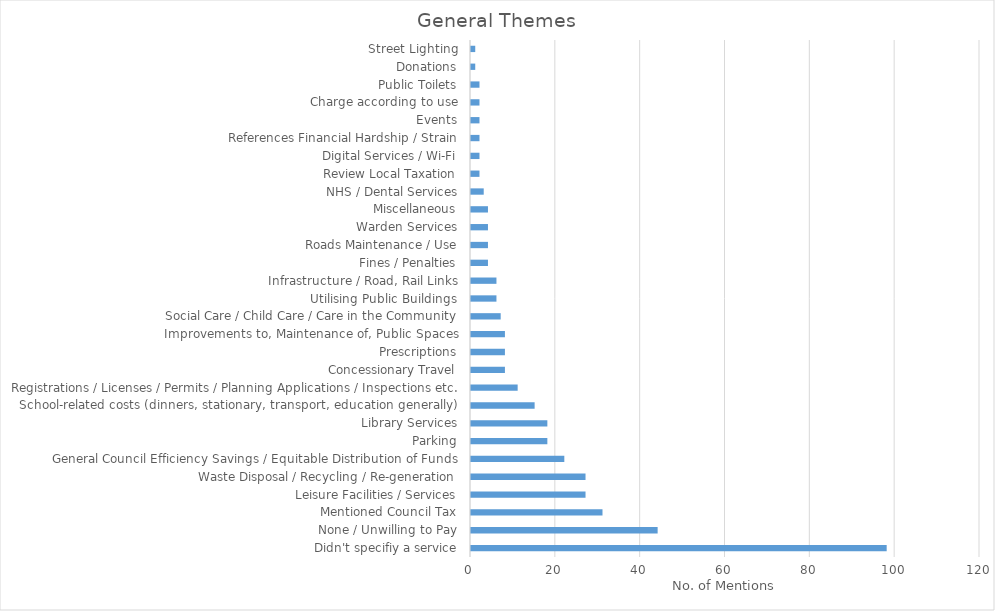
| Category | Series 0 |
|---|---|
| Didn't specifiy a service | 98 |
| None / Unwilling to Pay | 44 |
| Mentioned Council Tax | 31 |
| Leisure Facilities / Services | 27 |
| Waste Disposal / Recycling / Re-generation | 27 |
| General Council Efficiency Savings / Equitable Distribution of Funds | 22 |
| Parking | 18 |
| Library Services | 18 |
| School-related costs (dinners, stationary, transport, education generally) | 15 |
| Registrations / Licenses / Permits / Planning Applications / Inspections etc. | 11 |
| Concessionary Travel | 8 |
| Prescriptions | 8 |
| Improvements to, Maintenance of, Public Spaces | 8 |
| Social Care / Child Care / Care in the Community | 7 |
| Utilising Public Buildings | 6 |
| Infrastructure / Road, Rail Links | 6 |
| Fines / Penalties | 4 |
| Roads Maintenance / Use | 4 |
| Warden Services | 4 |
| Miscellaneous | 4 |
| NHS / Dental Services | 3 |
| Review Local Taxation | 2 |
| Digital Services / Wi-Fi | 2 |
| References Financial Hardship / Strain | 2 |
| Events | 2 |
| Charge according to use | 2 |
| Public Toilets | 2 |
| Donations | 1 |
| Street Lighting | 1 |